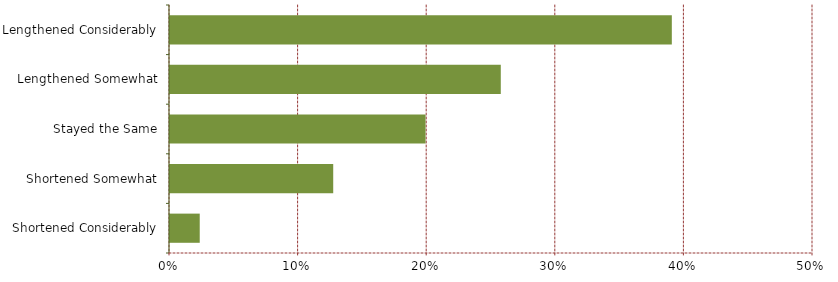
| Category | Series 0 |
|---|---|
| Shortened Considerably | 0.024 |
| Shortened Somewhat | 0.128 |
| Stayed the Same | 0.2 |
| Lengthened Somewhat | 0.258 |
| Lengthened Considerably | 0.391 |